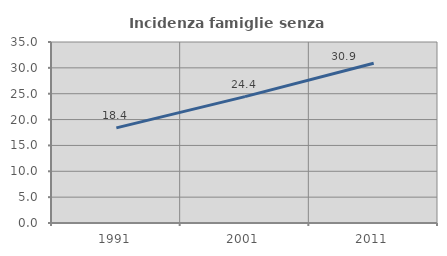
| Category | Incidenza famiglie senza nuclei |
|---|---|
| 1991.0 | 18.387 |
| 2001.0 | 24.433 |
| 2011.0 | 30.89 |